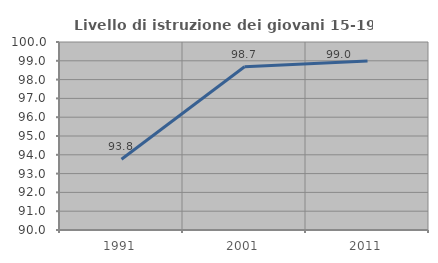
| Category | Livello di istruzione dei giovani 15-19 anni |
|---|---|
| 1991.0 | 93.766 |
| 2001.0 | 98.687 |
| 2011.0 | 98.985 |